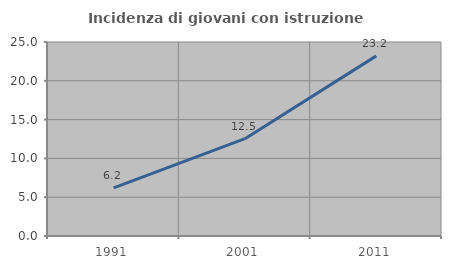
| Category | Incidenza di giovani con istruzione universitaria |
|---|---|
| 1991.0 | 6.19 |
| 2001.0 | 12.545 |
| 2011.0 | 23.214 |